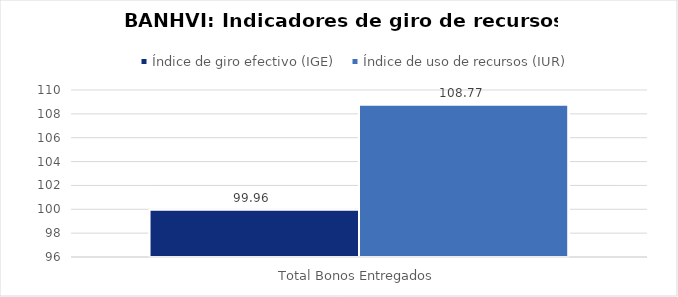
| Category | Índice de giro efectivo (IGE) | Índice de uso de recursos (IUR)  |
|---|---|---|
| Total Bonos Entregados | 99.961 | 108.772 |